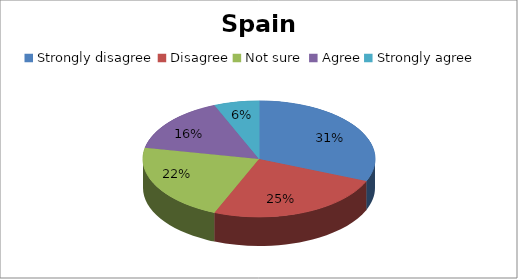
| Category | Series 0 |
|---|---|
| Strongly disagree | 10 |
| Disagree | 8 |
| Not sure  | 7 |
| Agree | 5 |
| Strongly agree | 2 |